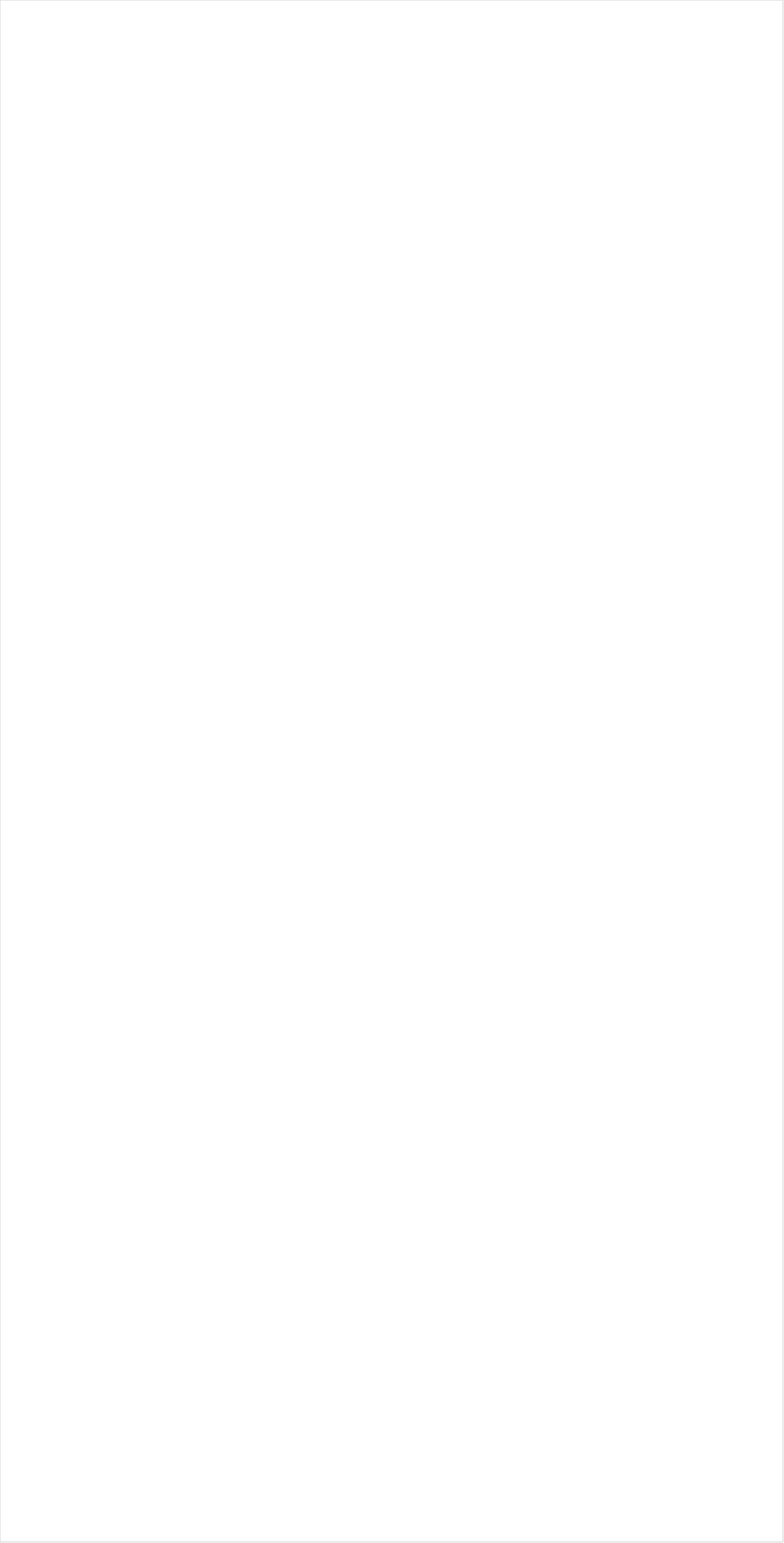
| Category | Total |
|---|---|
| Galavision | -0.933 |
| TUDN | -0.928 |
| Telemundo | -0.921 |
| UniMas | -0.908 |
| Univision | -0.81 |
| NBC Universo | -0.769 |
| MTV2 | -0.735 |
| Cartoon Network | -0.723 |
| VH1 | -0.67 |
| BET | -0.656 |
| TV ONE | -0.63 |
| BET Her | -0.605 |
| NBA TV | -0.537 |
| Teen Nick | -0.451 |
| Nick Jr. | -0.446 |
| Oprah Winfrey Network | -0.426 |
| Adult Swim | -0.421 |
| MSNBC | -0.41 |
| Lifetime Movies | -0.407 |
| Disney Channel | -0.4 |
| Nick Toons | -0.395 |
| Nick | -0.372 |
| CNN | -0.361 |
| Disney Junior US | -0.359 |
| Tennis Channel | -0.336 |
| Disney XD | -0.328 |
| ESPN Deportes | -0.32 |
| Nick@Nite | -0.314 |
| BRAVO | -0.313 |
| TLC | -0.234 |
| WE TV | -0.215 |
| Discovery Life Channel | -0.214 |
| Olympic Channel | -0.211 |
| Lifetime | -0.198 |
| Universal Kids | -0.19 |
| Freeform | -0.175 |
| Comedy Central | -0.16 |
| E! | -0.114 |
| MTV | -0.106 |
| Bloomberg HD | -0.097 |
| ESPN2 | -0.089 |
| FX | -0.084 |
| PBS | -0.074 |
| Hallmark Movies & Mysteries | -0.063 |
| FXX | -0.03 |
| HGTV | -0.026 |
| Logo | -0.024 |
| Investigation Discovery | -0.021 |
| Hallmark | -0.02 |
| PAC-12 Network | -0.016 |
| FX Movie Channel | 0.001 |
| truTV | 0.016 |
| TNT | 0.032 |
| UP TV | 0.047 |
| SYFY | 0.062 |
| CNBC | 0.067 |
| ION | 0.069 |
| OXYGEN | 0.073 |
| Discovery Family Channel | 0.074 |
| CW | 0.076 |
| Ovation | 0.079 |
| ESPN | 0.118 |
| Game Show | 0.125 |
| Golf | 0.129 |
| AMC | 0.129 |
| TBS | 0.133 |
| ABC | 0.149 |
| Travel | 0.152 |
| Food Network | 0.159 |
| Cooking Channel | 0.161 |
| Headline News | 0.166 |
| USA Network | 0.178 |
| CMTV | 0.188 |
| Reelz Channel | 0.222 |
| NFL Network | 0.231 |
| POP | 0.235 |
| NBC | 0.245 |
| BBC America | 0.246 |
| Independent Film (IFC) | 0.272 |
| TV LAND | 0.274 |
| Paramount Network | 0.283 |
| Viceland | 0.293 |
| MyNetworkTV | 0.302 |
| NHL | 0.305 |
| Fox Business | 0.348 |
| CBS | 0.353 |
| Great American Country | 0.432 |
| National Geographic Wild | 0.433 |
| Fox News | 0.462 |
| American Heroes Channel | 0.482 |
| Big Ten Network | 0.503 |
| MLB Network | 0.52 |
| A&E | 0.532 |
| SundanceTV | 0.535 |
| WGN America | 0.542 |
| ESPNU | 0.56 |
| INSP | 0.594 |
| ESPNEWS | 0.594 |
| DIY | 0.597 |
| The Sportsman Channel | 0.619 |
| Destination America | 0.629 |
| Smithsonian | 0.635 |
| National Geographic | 0.641 |
| Science Channel | 0.665 |
| Animal Planet | 0.684 |
| History Channel | 0.685 |
| Weather Channel | 0.846 |
| FYI | 0.889 |
| Discovery Channel | 0.899 |
| Outdoor Channel | 1.172 |
| FOX | 1.45 |
| Motor Trend Network | 1.572 |
| RFD TV | 1.647 |
| CBS Sports | 1.814 |
| NBC Sports | 1.87 |
| Fox Sports 1 | 2.943 |
| FOX Sports 2 | 3.595 |
| FXDEP | 4.449 |